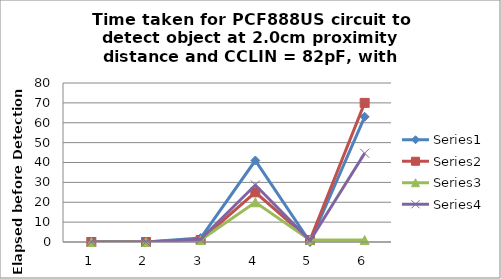
| Category | Series 0 | Series 1 | Series 2 | Series 3 |
|---|---|---|---|---|
| 0 | 0 | 0 | 0 | 0 |
| 1 | 0 | 0 | 0 | 0 |
| 2 | 2 | 1 | 1 | 1.333 |
| 3 | 41 | 25 | 20 | 28.667 |
| 4 | 0 | 1 | 1 | 0.667 |
| 5 | 63 | 70 | 1 | 44.667 |